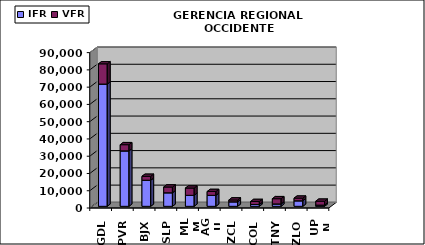
| Category | IFR | VFR |
|---|---|---|
| GDL | 70817 | 11708 |
| PVR | 32113 | 3581 |
| BJX | 15117 | 2260 |
| SLP | 7843 | 3330 |
| MLM | 6367 | 4206 |
| AGU | 6360 | 2225 |
| ZCL | 2608 | 1069 |
| COL | 1068 | 1726 |
| TNY | 1382 | 3030 |
| ZLO | 3200 | 1525 |
| UPN | 714 | 2245 |